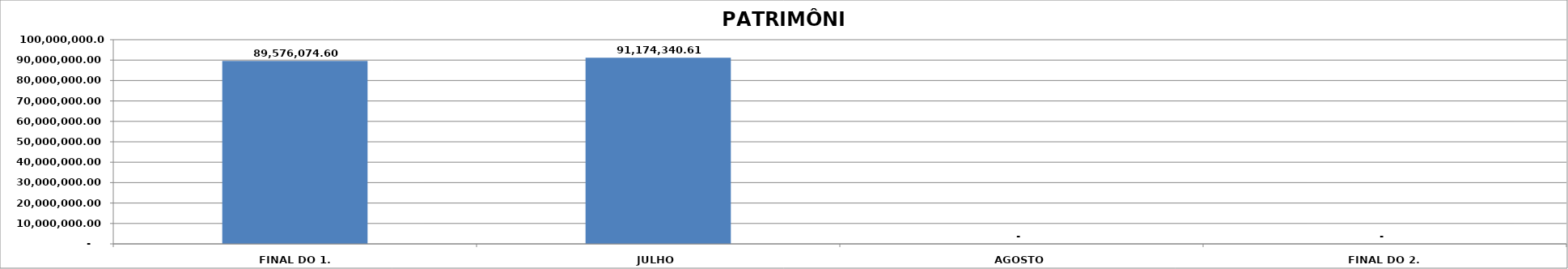
| Category | SALDO |
|---|---|
| FINAL DO 1. TRIMESTRE | 89576074.6 |
| JULHO | 91174340.61 |
| AGOSTO | 0 |
| FINAL DO 2. TRIMESTRE | 0 |